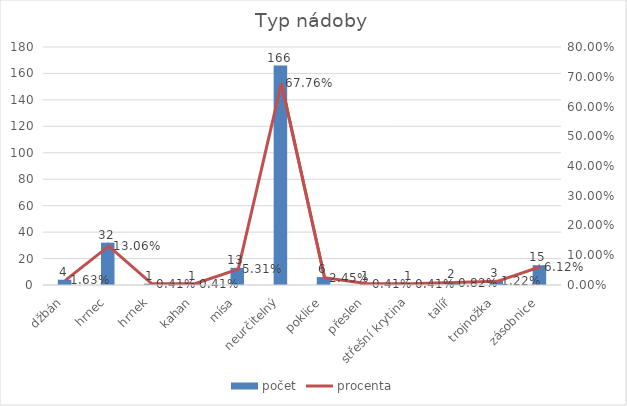
| Category | počet |
|---|---|
| džbán | 4 |
| hrnec | 32 |
| hrnek | 1 |
| kahan | 1 |
| mísa | 13 |
| neurčitelný | 166 |
| poklice | 6 |
| přeslen | 1 |
| střešní krytina | 1 |
| talíř | 2 |
| trojnožka | 3 |
| zásobnice | 15 |